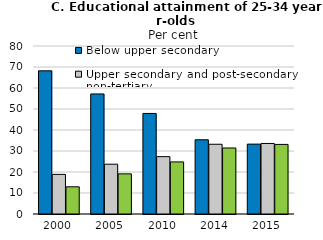
| Category | Below upper secondary | Upper secondary and post-secondary non-tertiary | Tertiary |
|---|---|---|---|
| 2000.0 | 68.184 | 18.868 | 12.949 |
| 2005.0 | 57.168 | 23.717 | 19.114 |
| 2010.0 | 47.884 | 27.311 | 24.805 |
| 2014.0 | 35.348 | 33.212 | 31.44 |
| 2015.0 | 33.275 | 33.585 | 33.14 |